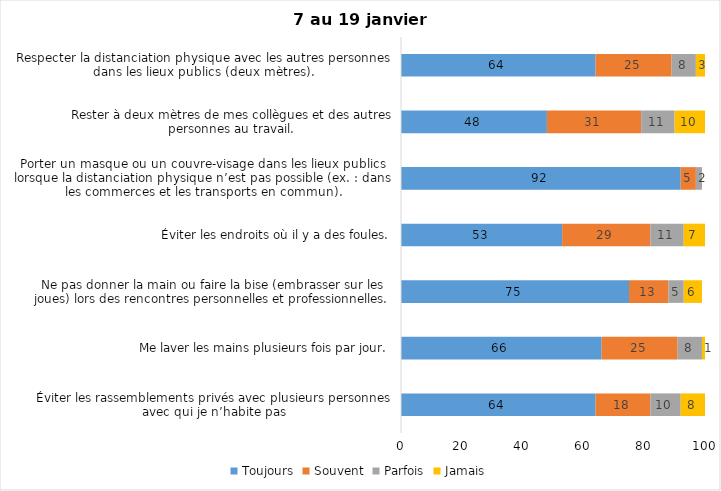
| Category | Toujours | Souvent | Parfois | Jamais |
|---|---|---|---|---|
| Éviter les rassemblements privés avec plusieurs personnes avec qui je n’habite pas | 64 | 18 | 10 | 8 |
| Me laver les mains plusieurs fois par jour. | 66 | 25 | 8 | 1 |
| Ne pas donner la main ou faire la bise (embrasser sur les joues) lors des rencontres personnelles et professionnelles. | 75 | 13 | 5 | 6 |
| Éviter les endroits où il y a des foules. | 53 | 29 | 11 | 7 |
| Porter un masque ou un couvre-visage dans les lieux publics lorsque la distanciation physique n’est pas possible (ex. : dans les commerces et les transports en commun). | 92 | 5 | 2 | 0 |
| Rester à deux mètres de mes collègues et des autres personnes au travail. | 48 | 31 | 11 | 10 |
| Respecter la distanciation physique avec les autres personnes dans les lieux publics (deux mètres). | 64 | 25 | 8 | 3 |